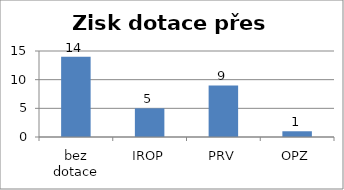
| Category | Zisk dotace přes MAS |
|---|---|
| bez dotace | 14 |
| IROP | 5 |
| PRV | 9 |
| OPZ | 1 |